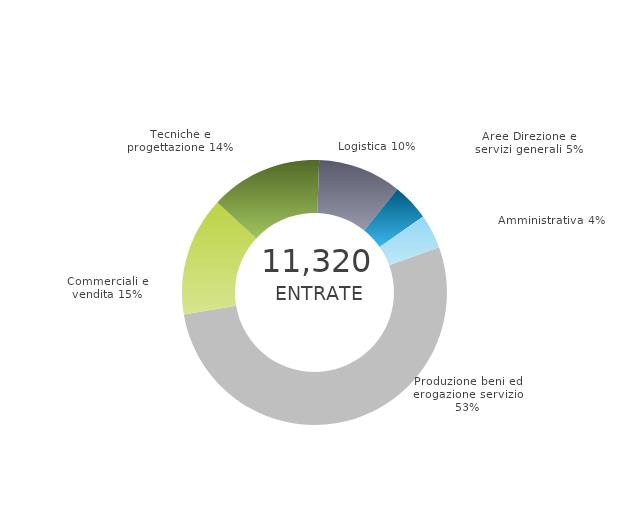
| Category | Series 0 | Series 1 |
|---|---|---|
| Produzione beni ed erogazione servizio | 0 | 0.529 |
| Commerciali e vendita | 0 | 0.146 |
| Tecniche e progettazione | 0 | 0.137 |
| Logistica | 0 | 0.102 |
| Aree Direzione e servizi generali | 0 | 0.045 |
| Amministrativa | 0 | 0.042 |